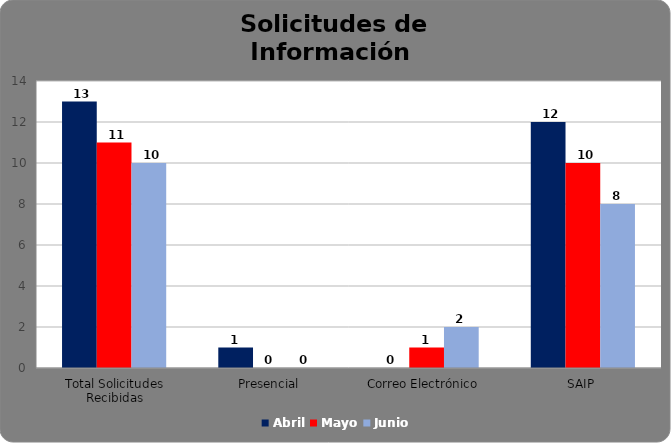
| Category | Abril | Mayo | Junio |
|---|---|---|---|
| Total Solicitudes Recibidas | 13 | 11 | 10 |
| Presencial | 1 | 0 | 0 |
| Correo Electrónico  | 0 | 1 | 2 |
| SAIP | 12 | 10 | 8 |